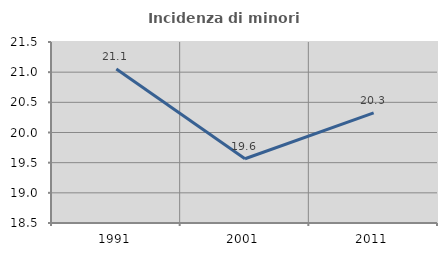
| Category | Incidenza di minori stranieri |
|---|---|
| 1991.0 | 21.053 |
| 2001.0 | 19.565 |
| 2011.0 | 20.325 |